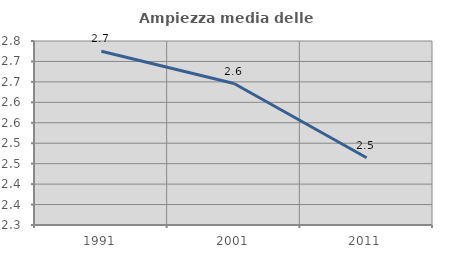
| Category | Ampiezza media delle famiglie |
|---|---|
| 1991.0 | 2.725 |
| 2001.0 | 2.646 |
| 2011.0 | 2.465 |